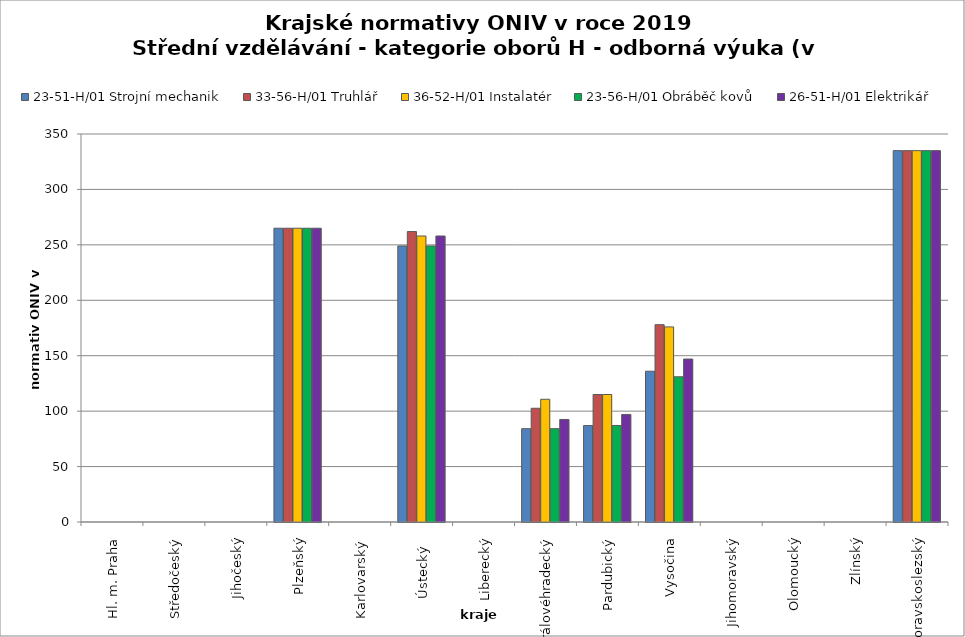
| Category | 23-51-H/01 Strojní mechanik | 33-56-H/01 Truhlář | 36-52-H/01 Instalatér | 23-56-H/01 Obráběč kovů | 26-51-H/01 Elektrikář |
|---|---|---|---|---|---|
| Hl. m. Praha | 0 | 0 | 0 | 0 | 0 |
| Středočeský | 0 | 0 | 0 | 0 | 0 |
| Jihočeský | 0 | 0 | 0 | 0 | 0 |
| Plzeňský | 265 | 265 | 265 | 265 | 265 |
| Karlovarský  | 0 | 0 | 0 | 0 | 0 |
| Ústecký   | 249 | 262 | 258 | 249 | 258 |
| Liberecký | 0 | 0 | 0 | 0 | 0 |
| Královéhradecký | 84.2 | 102.6 | 110.7 | 84.2 | 92.5 |
| Pardubický | 87 | 115 | 115 | 87 | 97 |
| Vysočina | 136 | 178 | 176 | 131 | 147 |
| Jihomoravský | 0 | 0 | 0 | 0 | 0 |
| Olomoucký | 0 | 0 | 0 | 0 | 0 |
| Zlínský | 0 | 0 | 0 | 0 | 0 |
| Moravskoslezský | 335 | 335 | 335 | 335 | 335 |